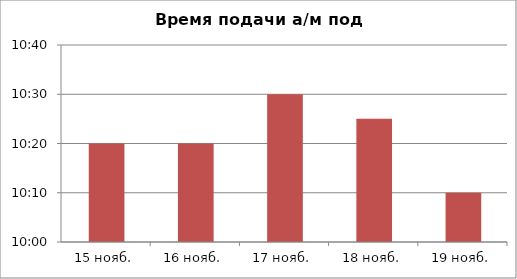
| Category | Время подачи а/м под погрузку |
|---|---|
| 2010-11-15 | 0.431 |
| 2010-11-16 | 0.431 |
| 2010-11-17 | 0.438 |
| 2010-11-18 | 0.434 |
| 2010-11-19 | 0.424 |